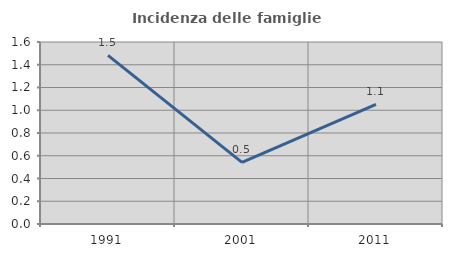
| Category | Incidenza delle famiglie numerose |
|---|---|
| 1991.0 | 1.483 |
| 2001.0 | 0.542 |
| 2011.0 | 1.052 |